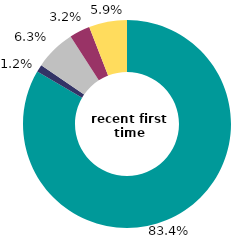
| Category | recent first time buyers  |
|---|---|
| White | 83.422 |
| Black | 1.151 |
| Indian | 6.305 |
| Pakistani or Bangladeshi | 3.208 |
| Chinese and other | 5.914 |